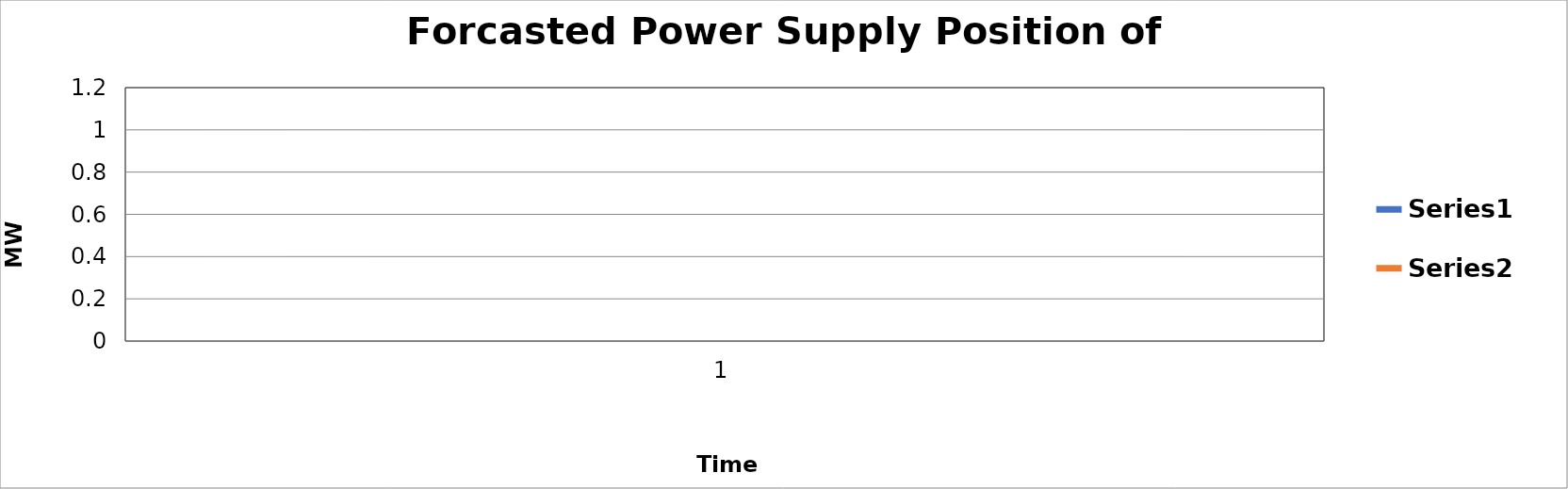
| Category | Series 0 | Series 1 |
|---|---|---|
| 0 | 1 | 1 |